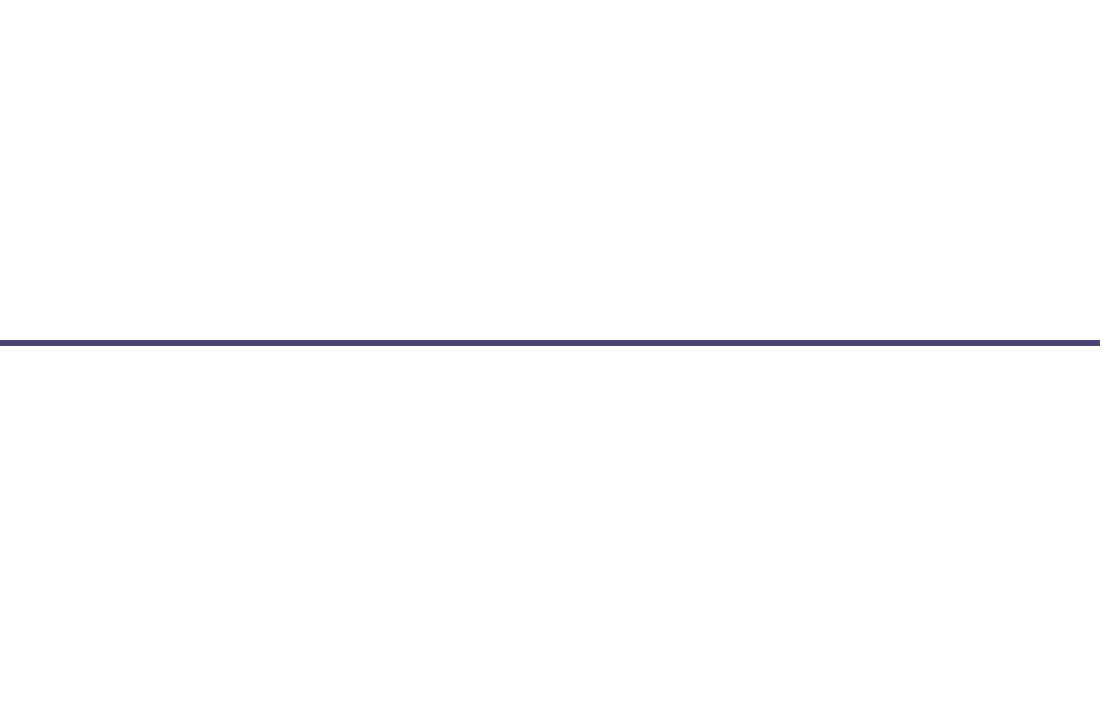
| Category | Posisi |
|---|---|
| 0 | 1 |
| 1 | -2 |
| 2 | 1 |
| 3 | -1 |
| 4 | -0.5 |
| 5 | 2 |
| 6 | 0.5 |
| 7 | -1 |
| 8 | 0.5 |
| 9 | -2 |